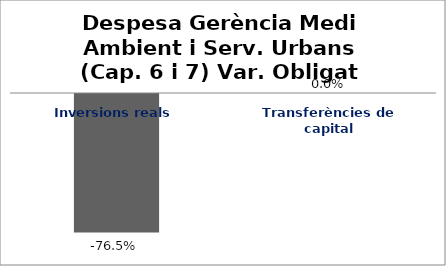
| Category | Series 0 |
|---|---|
| Inversions reals | -0.765 |
| Transferències de capital | 0 |